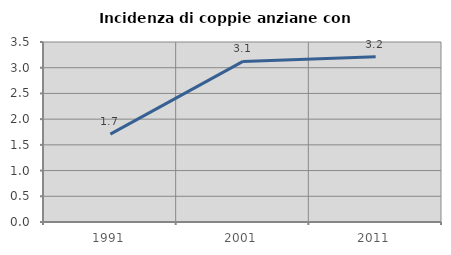
| Category | Incidenza di coppie anziane con figli |
|---|---|
| 1991.0 | 1.708 |
| 2001.0 | 3.123 |
| 2011.0 | 3.212 |